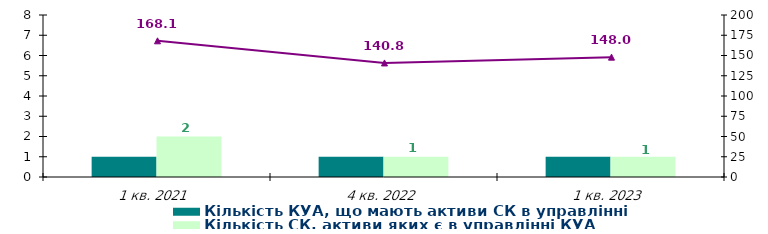
| Category | Кількість КУА, що мають активи СК в управлінні | Кількість СК, активи яких є в управлінні КУА |
|---|---|---|
| 1 кв. 2021 | 1 | 2 |
| 4 кв. 2022 | 1 | 1 |
| 1 кв. 2023 | 1 | 1 |